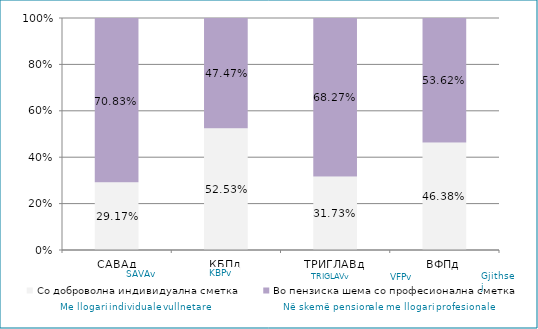
| Category | Со доброволна индивидуална сметка  | Во пензиска шема со професионална сметка |
|---|---|---|
| САВАд | 0.292 | 0.708 |
| КБПд | 0.525 | 0.475 |
| ТРИГЛАВд | 0.317 | 0.683 |
| ВФПд | 0.464 | 0.536 |